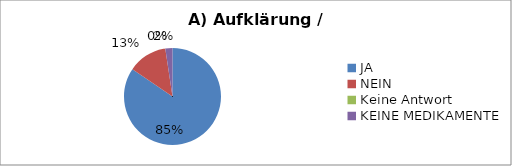
| Category | Series 0 |
|---|---|
| JA | 71 |
| NEIN | 11 |
| Keine Antwort | 0 |
| KEINE MEDIKAMENTE | 2 |